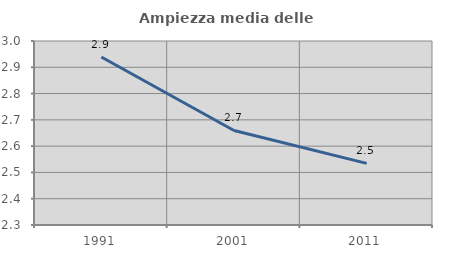
| Category | Ampiezza media delle famiglie |
|---|---|
| 1991.0 | 2.939 |
| 2001.0 | 2.66 |
| 2011.0 | 2.534 |